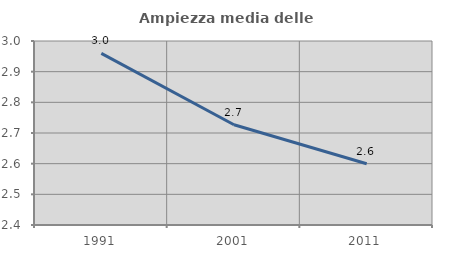
| Category | Ampiezza media delle famiglie |
|---|---|
| 1991.0 | 2.96 |
| 2001.0 | 2.727 |
| 2011.0 | 2.6 |